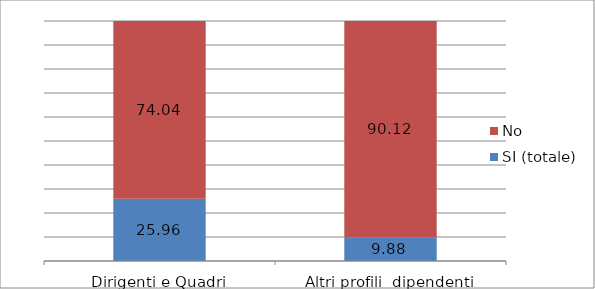
| Category | SI (totale) | No |
|---|---|---|
| Dirigenti e Quadri | 25.964 | 74.036 |
| Altri profili  dipendenti | 9.875 | 90.125 |